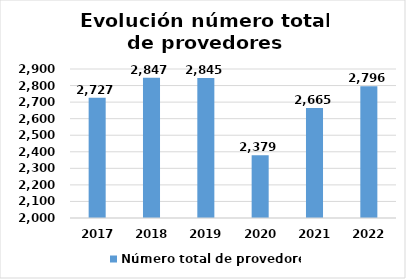
| Category | Número total de provedores |
|---|---|
| 2017.0 | 2727 |
| 2018.0 | 2847 |
| 2019.0 | 2845 |
| 2020.0 | 2379 |
| 2021.0 | 2665 |
| 2022.0 | 2796 |